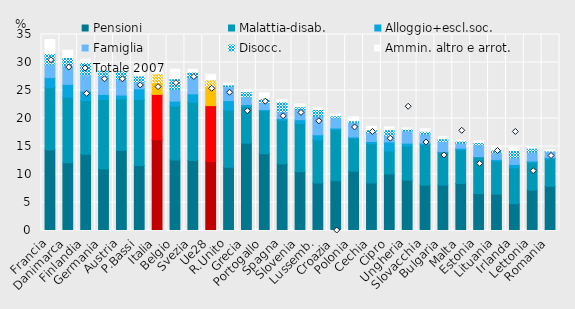
| Category | Pensioni | Malattia-disab. | Alloggio+escl.soc. | Famiglia | Disocc. | Ammin. altro e arrot. |
|---|---|---|---|---|---|---|
| Francia | 14.4 | 11.1 | 1.8 | 2.4 | 1.9 | 2.5 |
| Danimarca | 12.1 | 11.7 | 2.3 | 3.4 | 1.4 | 1.3 |
| Finlandia | 13.6 | 9.6 | 1.7 | 2.9 | 2.2 | 0.6 |
| Germania | 11 | 12.4 | 0.9 | 3.3 | 1 | 1.1 |
| Austria | 14.3 | 9.2 | 0.7 | 2.7 | 1.6 | 0.9 |
| P.Bassi | 11.6 | 11.8 | 1.9 | 1.2 | 1.1 | 1.7 |
| Italia | 16.2 | 8.1 | 0.3 | 1.8 | 1.6 | 1.1 |
| Belgio | 12.6 | 9.6 | 0.9 | 2.1 | 1.9 | 1.7 |
| Svezia | 12.5 | 10.4 | 1.5 | 2.9 | 1 | 0.5 |
| Ue28 | 12.3 | 10 | 1.1 | 2.3 | 1.2 | 1 |
| R.Unito | 11.3 | 10.2 | 1.7 | 2.5 | 0.3 | 0.3 |
| Grecia | 15.6 | 6.5 | 0.4 | 1.4 | 0.9 | 0.4 |
| Portogallo | 13.7 | 7.7 | 0.2 | 1.2 | 0.8 | 1 |
| Spagna | 11.9 | 7.8 | 0.3 | 1.2 | 1.8 | 0.4 |
| Slovenia | 10.5 | 8.6 | 0.7 | 1.8 | 0.5 | 0.5 |
| Lussemb. | 8.5 | 7.7 | 0.9 | 3.3 | 1.2 | 0.3 |
| Croazia | 8.9 | 9.1 | 0.3 | 1.8 | 0.4 | 0.3 |
| Polonia | 10.6 | 5.9 | 0.2 | 2.6 | 0.3 | 0.7 |
| Cechia | 8.5 | 7 | 0.4 | 1.6 | 0.5 | 0.6 |
| Cipro | 10.1 | 4.1 | 1.6 | 1.2 | 1 | 0.5 |
| Ungheria | 9 | 6.1 | 0.5 | 2.2 | 0.3 | 0.2 |
| Slovacchia | 8.1 | 7.2 | 0.3 | 1.6 | 0.5 | 0.5 |
| Bulgaria | 8.1 | 5.8 | 0.2 | 1.8 | 0.5 | 0.4 |
| Malta | 8.4 | 6 | 0.3 | 0.9 | 0.4 | 0.1 |
| Estonia | 6.6 | 6.5 | 0.1 | 2.1 | 0.4 | 0.3 |
| Lituania | 6.5 | 5.9 | 0.3 | 1.2 | 0.5 | 0.7 |
| Irlanda | 4.8 | 6.4 | 0.6 | 1.2 | 1.3 | 0.6 |
| Lettonia | 7.2 | 5 | 0.2 | 1.6 | 0.7 | 0.2 |
| Romania | 7.9 | 4.9 | 0.2 | 1.1 | 0.1 | 0.2 |